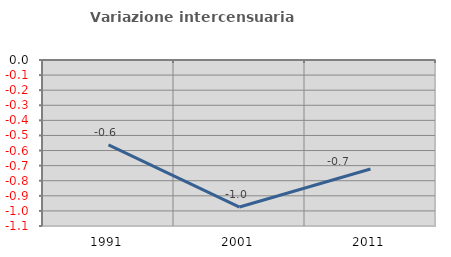
| Category | Variazione intercensuaria annua |
|---|---|
| 1991.0 | -0.563 |
| 2001.0 | -0.974 |
| 2011.0 | -0.722 |